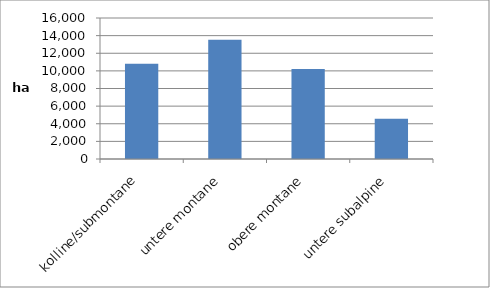
| Category | Kanton Luzern |
|---|---|
| kolline/submontane | 10795 |
| untere montane | 13519 |
| obere montane | 10212 |
| untere subalpine | 4578 |